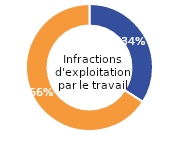
| Category | Infractions d'exploitation par le travail |
|---|---|
| Femme (%) | 34.06 |
| Homme (%) | 65.78 |